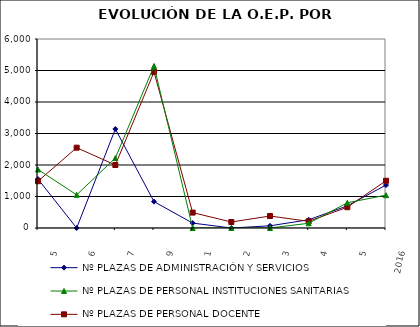
| Category | Nº PLAZAS DE ADMINISTRACIÓN Y SERVICIOS |
|---|---|
| 2005.0 | 1553 |
| 2006.0 | 0 |
| 2007.0 | 3142 |
| 2009.0 | 837 |
| 2011.0 | 156 |
| 2012.0 | 0 |
| 2013.0 | 69 |
| 2014.0 | 262 |
| 2015.0 | 702 |
| 2016.0 | 1364 |